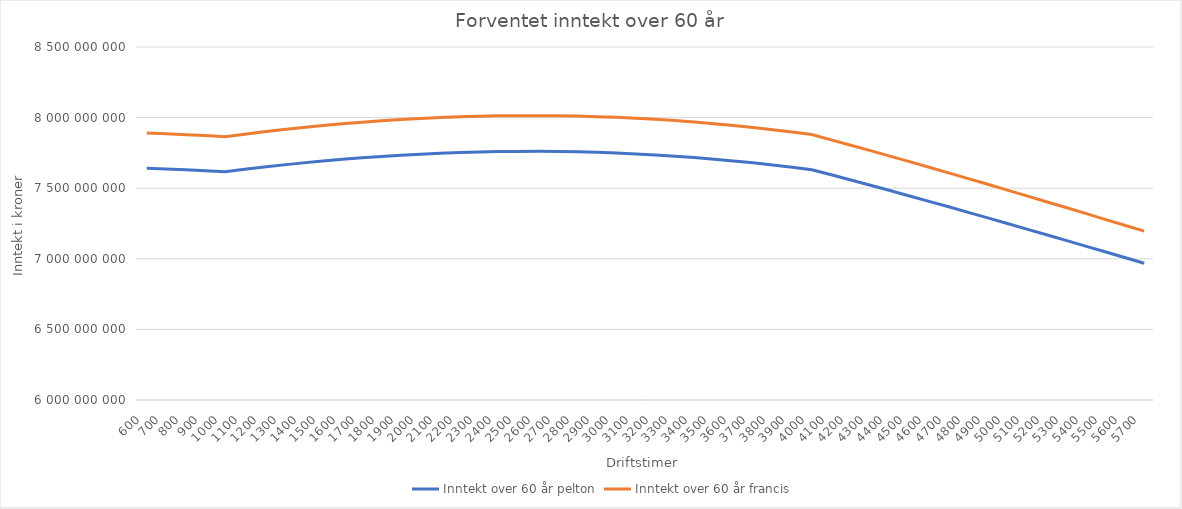
| Category | Inntekt over 60 år pelton | Inntekt over 60 år francis |
|---|---|---|
| 600.0 | 7641286331.069 | 7890458711.43 |
| 700.0 | 7636251968.141 | 7885260184.494 |
| 800.0 | 7630453556.84 | 7879272694.563 |
| 900.0 | 7623895565.185 | 7872500855.354 |
| 1000.0 | 7616583044.499 | 7864949882.907 |
| 1100.0 | 7633803839.269 | 7882732225.332 |
| 1200.0 | 7650030392.344 | 7899487905.138 |
| 1300.0 | 7665237935.422 | 7915191346.36 |
| 1400.0 | 7679402680.828 | 7929817985.637 |
| 1500.0 | 7692501854.427 | 7943344306.202 |
| 1600.0 | 7704513727.415 | 7955747870.7 |
| 1700.0 | 7715417646.932 | 7967007352.81 |
| 1800.0 | 7725194065.478 | 7977102567.613 |
| 1900.0 | 7733824569.071 | 7986014500.671 |
| 2000.0 | 7741291904.12 | 7993725335.776 |
| 2100.0 | 7747580002.974 | 8000218481.332 |
| 2200.0 | 7752674008.111 | 8005478595.332 |
| 2300.0 | 7756560294.932 | 8009491608.897 |
| 2400.0 | 7759226493.135 | 8012244748.346 |
| 2500.0 | 7760661506.626 | 8013726555.755 |
| 2600.0 | 7760855531.951 | 8013926907.993 |
| 2700.0 | 7759800075.218 | 8012837034.193 |
| 2800.0 | 7757487967.481 | 8010449531.638 |
| 2900.0 | 7753913378.564 | 8006758380.039 |
| 3000.0 | 7749071829.314 | 8001758954.183 |
| 3100.0 | 7742960202.246 | 7995448034.928 |
| 3200.0 | 7735576750.576 | 7987823818.53 |
| 3300.0 | 7726921105.627 | 7978885924.289 |
| 3400.0 | 7716994282.585 | 7968635400.495 |
| 3500.0 | 7705798684.603 | 7957074728.666 |
| 3600.0 | 7693338105.243 | 7944207826.066 |
| 3700.0 | 7679617729.243 | 7930040046.501 |
| 3800.0 | 7664644131.609 | 7914578179.379 |
| 3900.0 | 7648425275.033 | 7897830447.044 |
| 4000.0 | 7630970505.62 | 7879806500.369 |
| 4100.0 | 7594730904.016 | 7842385172.626 |
| 4200.0 | 7558012573.211 | 7804469504.946 |
| 4300.0 | 7520842518.914 | 7766087383.661 |
| 4400.0 | 7483248005.86 | 7727266962.572 |
| 4500.0 | 7445256533.477 | 7688036637.829 |
| 4600.0 | 7406895811.378 | 7648425022.619 |
| 4700.0 | 7368193734.71 | 7608460921.711 |
| 4800.0 | 7329178359.377 | 7568173305.879 |
| 4900.0 | 7289877877.174 | 7527591286.212 |
| 5000.0 | 7250320590.837 | 7486744088.364 |
| 5100.0 | 7210534889.054 | 7445661026.74 |
| 5200.0 | 7170549221.447 | 7404371478.668 |
| 5300.0 | 7130392073.552 | 7362904858.559 |
| 5400.0 | 7090091941.829 | 7321290592.106 |
| 5500.0 | 7049677308.713 | 7279558090.519 |
| 5600.0 | 7009176617.747 | 7237736724.847 |
| 5700.0 | 6968618248.803 | 7195855800.395 |